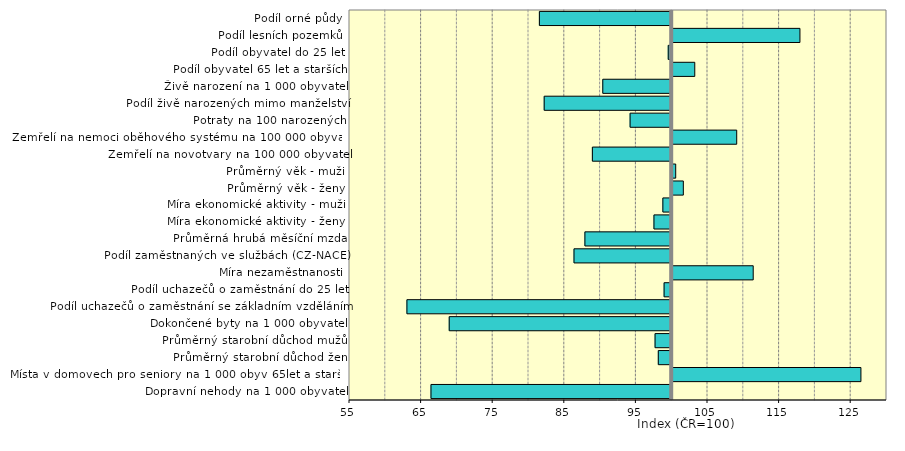
| Category | Series 0 |
|---|---|
| Dopravní nehody na 1 000 obyvatel | 66.383 |
| Místa v domovech pro seniory na 1 000 obyv 65let a starších | 126.359 |
| Průměrný starobní důchod žen | 98.129 |
| Průměrný starobní důchod mužů | 97.678 |
| Dokončené byty na 1 000 obyvatel | 68.929 |
| Podíl uchazečů o zaměstnání se základním vzděláním | 63.02 |
| Podíl uchazečů o zaměstnání do 25 let | 98.938 |
| Míra nezaměstnanosti | 111.315 |
| Podíl zaměstnaných ve službách (CZ-NACE) | 86.357 |
| Průměrná hrubá měsíční mzda | 87.878 |
| Míra ekonomické aktivity - ženy | 97.523 |
| Míra ekonomické aktivity - muži | 98.766 |
| Průměrný věk - ženy | 101.556 |
| Průměrný věk - muži | 100.49 |
| Zemřelí na novotvary na 100 000 obyvatel | 88.922 |
| Zemřelí na nemoci oběhového systému na 100 000 obyvatel | 109.01 |
| Potraty na 100 narozených | 94.19 |
| Podíl živě narozených mimo manželství | 82.191 |
| Živě narození na 1 000 obyvatel | 90.376 |
| Podíl obyvatel 65 let a starších | 103.152 |
| Podíl obyvatel do 25 let | 99.517 |
| Podíl lesních pozemků | 117.842 |
| Podíl orné půdy | 81.521 |